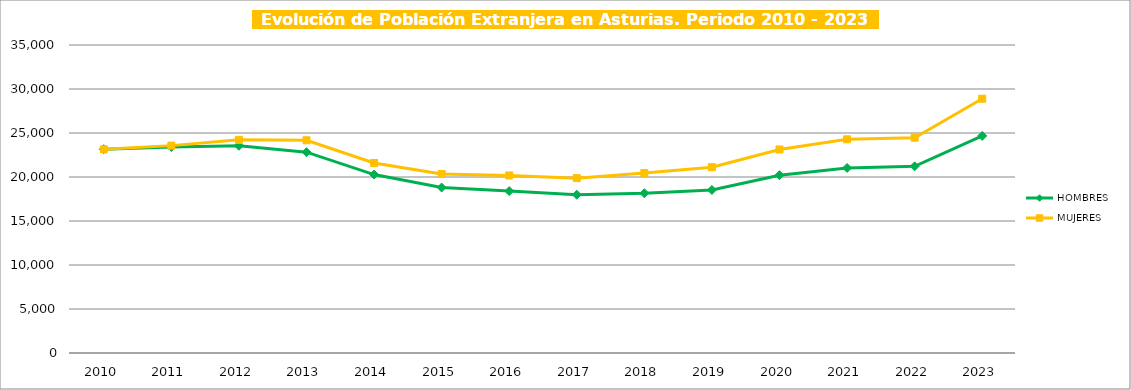
| Category | HOMBRES  | MUJERES  |
|---|---|---|
| 2010.0 | 23159 | 23141 |
| 2011.0 | 23408 | 23565 |
| 2012.0 | 23549 | 24223 |
| 2013.0 | 22819 | 24174 |
| 2014.0 | 20278 | 21591 |
| 2015.0 | 18801 | 20341 |
| 2016.0 | 18401 | 20175 |
| 2017.0 | 17985 | 19871 |
| 2018.0 | 18154 | 20460 |
| 2019.0 | 18529 | 21118 |
| 2020.0 | 20208 | 23129 |
| 2021.0 | 21029 | 24280 |
| 2022.0 | 21213 | 24466 |
| 2023.0 | 24675 | 28897 |